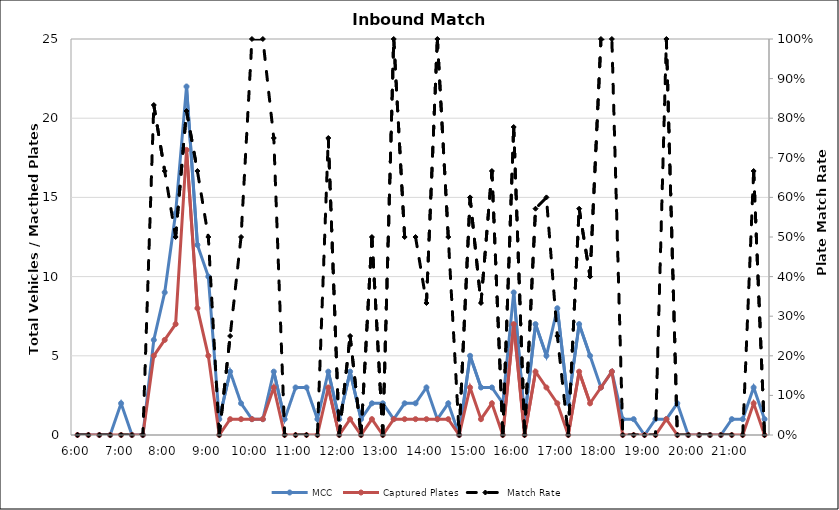
| Category | MCC | Captured Plates |
|---|---|---|
| 0.25 | 0 | 0 |
| 0.260416666666667 | 0 | 0 |
| 0.270833333333333 | 0 | 0 |
| 0.28125 | 0 | 0 |
| 0.291666666666667 | 2 | 0 |
| 0.302083333333333 | 0 | 0 |
| 0.3125 | 0 | 0 |
| 0.322916666666667 | 6 | 5 |
| 0.333333333333333 | 9 | 6 |
| 0.34375 | 14 | 7 |
| 0.354166666666667 | 22 | 18 |
| 0.364583333333333 | 12 | 8 |
| 0.375 | 10 | 5 |
| 0.385416666666667 | 1 | 0 |
| 0.395833333333333 | 4 | 1 |
| 0.40625 | 2 | 1 |
| 0.416666666666667 | 1 | 1 |
| 0.427083333333333 | 1 | 1 |
| 0.4375 | 4 | 3 |
| 0.447916666666667 | 1 | 0 |
| 0.458333333333333 | 3 | 0 |
| 0.46875 | 3 | 0 |
| 0.479166666666667 | 1 | 0 |
| 0.489583333333333 | 4 | 3 |
| 0.5 | 1 | 0 |
| 0.510416666666667 | 4 | 1 |
| 0.520833333333333 | 1 | 0 |
| 0.53125 | 2 | 1 |
| 0.541666666666667 | 2 | 0 |
| 0.552083333333333 | 1 | 1 |
| 0.5625 | 2 | 1 |
| 0.572916666666667 | 2 | 1 |
| 0.583333333333333 | 3 | 1 |
| 0.59375 | 1 | 1 |
| 0.604166666666667 | 2 | 1 |
| 0.614583333333333 | 0 | 0 |
| 0.625 | 5 | 3 |
| 0.635416666666667 | 3 | 1 |
| 0.645833333333333 | 3 | 2 |
| 0.65625 | 2 | 0 |
| 0.666666666666667 | 9 | 7 |
| 0.677083333333333 | 1 | 0 |
| 0.6875 | 7 | 4 |
| 0.697916666666667 | 5 | 3 |
| 0.708333333333333 | 8 | 2 |
| 0.71875 | 2 | 0 |
| 0.729166666666667 | 7 | 4 |
| 0.739583333333333 | 5 | 2 |
| 0.75 | 3 | 3 |
| 0.760416666666667 | 4 | 4 |
| 0.770833333333333 | 1 | 0 |
| 0.78125 | 1 | 0 |
| 0.791666666666667 | 0 | 0 |
| 0.802083333333333 | 1 | 0 |
| 0.8125 | 1 | 1 |
| 0.822916666666667 | 2 | 0 |
| 0.833333333333333 | 0 | 0 |
| 0.84375 | 0 | 0 |
| 0.854166666666667 | 0 | 0 |
| 0.864583333333333 | 0 | 0 |
| 0.875 | 1 | 0 |
| 0.885416666666667 | 1 | 0 |
| 0.895833333333333 | 3 | 2 |
| 0.90625 | 1 | 0 |